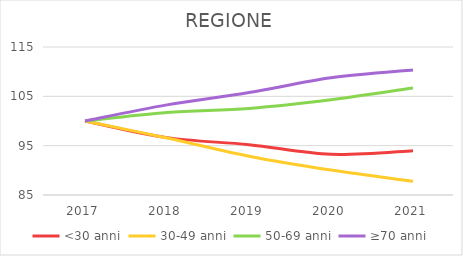
| Category | <30 anni | 30-49 anni | 50-69 anni | ≥70 anni |
|---|---|---|---|---|
| 2017.0 | 100 | 100 | 100 | 100 |
| 2018.0 | 96.631 | 96.555 | 101.729 | 103.266 |
| 2019.0 | 95.196 | 92.867 | 102.546 | 105.765 |
| 2020.0 | 93.242 | 90.055 | 104.295 | 108.755 |
| 2021.0 | 93.98 | 87.771 | 106.69 | 110.336 |